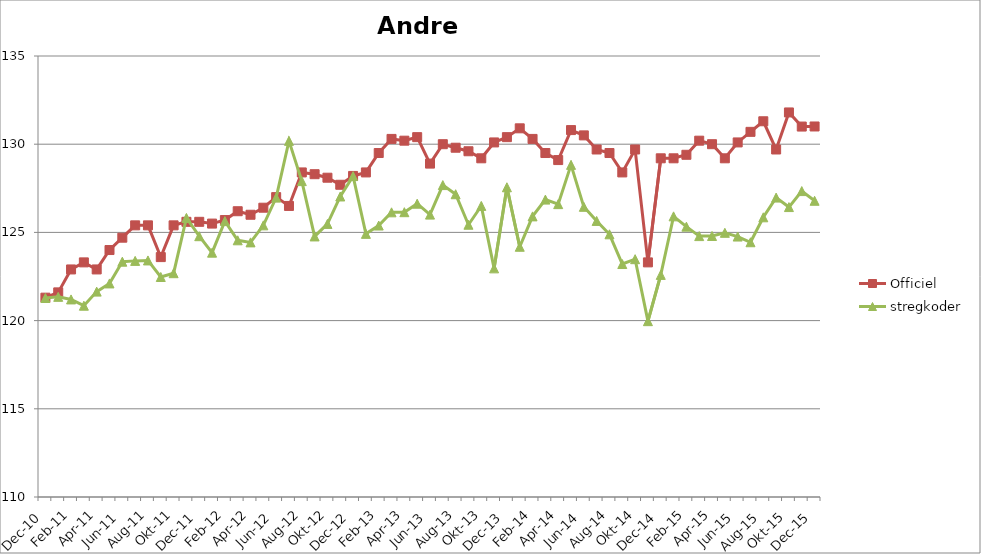
| Category | Officiel | stregkoder |
|---|---|---|
|  Dec-10 | 121.3 | 121.281 |
|  Jan-11 | 121.6 | 121.346 |
|  Feb-11 | 122.9 | 121.2 |
|  Mar-11 | 123.3 | 120.844 |
|  Apr-11 | 122.9 | 121.643 |
|  Maj-11 | 124 | 122.107 |
|  Jun-11 | 124.7 | 123.34 |
|  Jul-11 | 125.4 | 123.386 |
|  Aug-11 | 125.4 | 123.411 |
|  Sep-11 | 123.6 | 122.472 |
|  Okt-11 | 125.4 | 122.687 |
|  Nov-11 | 125.6 | 125.821 |
|  Dec-11 | 125.6 | 124.785 |
|  Jan-12 | 125.5 | 123.851 |
|  Feb-12 | 125.7 | 125.64 |
|  Mar-12 | 126.2 | 124.552 |
|  Apr-12 | 126 | 124.434 |
|  Maj-12 | 126.4 | 125.4 |
|  Jun-12 | 127 | 126.974 |
|  Jul-12 | 126.5 | 130.189 |
|  Aug-12 | 128.4 | 127.907 |
|  Sep-12 | 128.3 | 124.771 |
|  Okt-12 | 128.1 | 125.481 |
|  Nov-12 | 127.7 | 127.037 |
|  Dec-12 | 128.2 | 128.192 |
|  Jan-13 | 128.4 | 124.916 |
|  Feb-13 | 129.5 | 125.389 |
|  Mar-13 | 130.3 | 126.138 |
|  Apr-13 | 130.2 | 126.145 |
|  Maj-13 | 130.4 | 126.627 |
|  Jun-13 | 128.9 | 126.008 |
|  Jul-13 | 130 | 127.682 |
|  Aug-13 | 129.8 | 127.164 |
|  Sep-13 | 129.6 | 125.434 |
|  Okt-13 | 129.2 | 126.501 |
|  Nov-13 | 130.1 | 122.961 |
|  Dec-13 | 130.4 | 127.557 |
|  Jan-14 | 130.9 | 124.185 |
|  Feb-14 | 130.3 | 125.908 |
|  Mar-14 | 129.5 | 126.86 |
|  Apr-14 | 129.1 | 126.602 |
|  Maj-14 | 130.8 | 128.828 |
|  Jun-14 | 130.5 | 126.45 |
|  Jul-14 | 129.7 | 125.65 |
|  Aug-14 | 129.5 | 124.892 |
|  Sep-14 | 128.4 | 123.208 |
|  Okt-14 | 129.7 | 123.482 |
|  Nov-14 | 123.3 | 119.968 |
|  Dec-14 | 129.2 | 122.591 |
|  Jan-15 | 129.2 | 125.91 |
|  Feb-15 | 129.4 | 125.325 |
|  Mar-15 | 130.2 | 124.79 |
|  Apr-15 | 130 | 124.797 |
|  Maj-15 | 129.2 | 124.976 |
| Jun-15 | 130.1 | 124.764 |
| Jul-15 | 130.7 | 124.442 |
| Aug-15 | 131.3 | 125.856 |
| Sep-15 | 129.7 | 126.974 |
| Okt-15 | 131.8 | 126.436 |
| Nov-15 | 131 | 127.342 |
| Dec-15 | 131.004 | 126.792 |